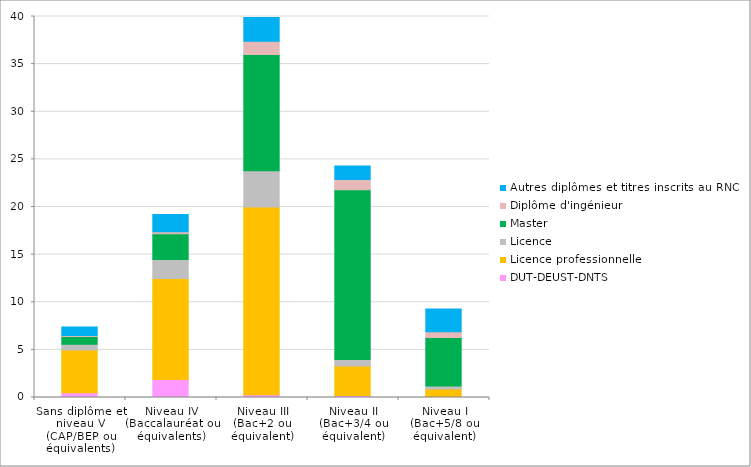
| Category | DUT-DEUST-DNTS | Licence professionnelle | Licence | Master | Diplôme d'ingénieur | Autres diplômes et titres inscrits au RNCP |
|---|---|---|---|---|---|---|
| Sans diplôme et niveau V
(CAP/BEP ou équivalents) | 0.5 | 4.5 | 0.6 | 0.8 | 0.1 | 0.9 |
| Niveau IV
(Baccalauréat ou équivalents) | 1.9 | 10.6 | 2 | 2.7 | 0.2 | 1.8 |
| Niveau III
(Bac+2 ou équivalent) | 0.3 | 19.7 | 3.8 | 12.2 | 1.4 | 2.5 |
| Niveau II
(Bac+3/4 ou équivalent) | 0.2 | 3.1 | 0.7 | 17.8 | 1.1 | 1.4 |
| Niveau I
(Bac+5/8 ou équivalent) | 0.1 | 0.8 | 0.3 | 5.1 | 0.6 | 2.4 |